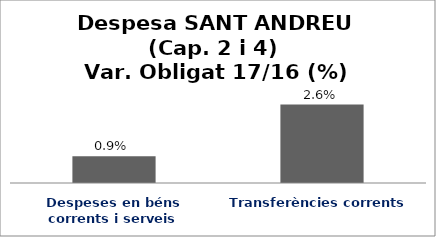
| Category | Series 0 |
|---|---|
| Despeses en béns corrents i serveis | 0.009 |
| Transferències corrents | 0.026 |